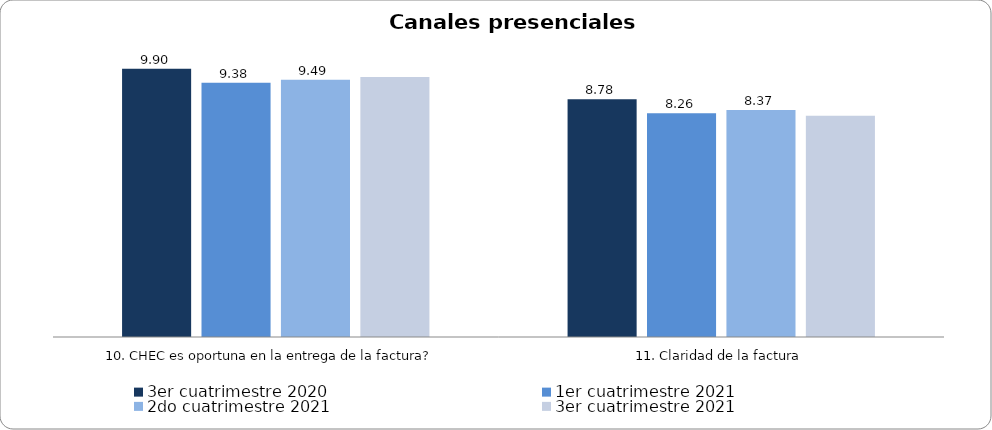
| Category | 3er cuatrimestre 2020 | Septiembre - Octubre 2018 | 1er cuatrimestre 2021 | Noviembre - Diciembre 2018 | 1er cuatrimestre 2019 | 2do cuatrimestre 2019 | 2do cuatrimestre 2021 | 3er cuatrimestre 2021 |
|---|---|---|---|---|---|---|---|---|
| 10. CHEC es oportuna en la entrega de la factura? | 9.896 |  | 9.379 |  |  |  | 9.489 | 9.593 |
| 11. Claridad de la factura | 8.777 |  | 8.255 |  |  |  | 8.372 | 8.163 |